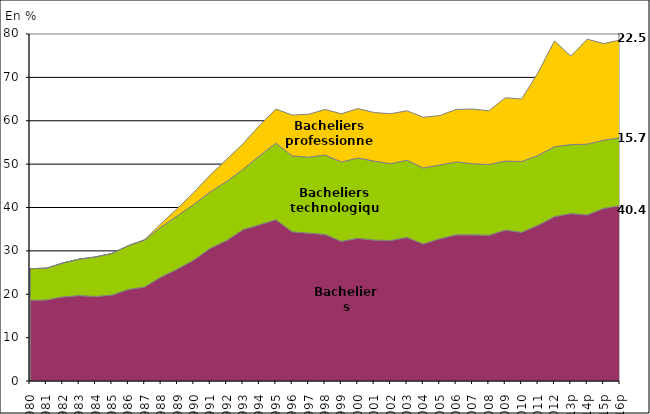
| Category | Bacheliers généraux | Bacheliers technologiques | Bacheliers professionnels |
|---|---|---|---|
| 1980 | 18.6 | 7.3 | 0 |
| 1981 | 18.7 | 7.3 | 0 |
| 1982 | 19.4 | 7.8 | 0 |
| 1983 | 19.7 | 8.4 | 0 |
| 1984 | 19.5 | 9.1 | 0 |
| 1985 | 19.8 | 9.6 | 0 |
| 1986 | 21.1 | 10.1 | 0 |
| 1987 | 21.7 | 10.8 | 0.1 |
| 1988 | 24 | 11.5 | 0.8 |
| 1989 | 25.8 | 12.3 | 1.7 |
| 1990 | 27.9 | 12.8 | 2.8 |
| 1991 | 30.6 | 13 | 3.9 |
| 1992 | 32.4 | 13.6 | 5.1 |
| 1993 | 34.9 | 13.9 | 5.9 |
| 1994 | 36 | 15.9 | 7 |
| 1995 | 37.2 | 17.6 | 7.9 |
| 1996 | 34.4 | 17.5 | 9.4 |
| 1997 | 34.1 | 17.5 | 9.9 |
| 1998 | 33.8 | 18.3 | 10.5 |
| 1999 | 32.2 | 18.3 | 11.1 |
| 2000 | 32.9 | 18.5 | 11.4 |
| 2001 | 32.5 | 18.2 | 11.2 |
| 2002 | 32.4 | 17.7 | 11.5 |
| 2003 | 33.1 | 17.8 | 11.4 |
| 2004 | 31.6 | 17.5 | 11.7 |
| 2005 | 32.8 | 17 | 11.4 |
| 2006 | 33.7 | 16.8 | 12.1 |
| 2007 | 33.7 | 16.4 | 12.6 |
| 2008 | 33.6 | 16.3 | 12.4 |
| 2009 | 34.8 | 15.9 | 14.6 |
| 2010 | 34.3 | 16.3 | 14.4 |
| 2011 | 35.9 | 16.1 | 19.1 |
| 2012 | 37.9 | 16.1 | 24.4 |
| 2013p | 38.6 | 15.9 | 20.4 |
| 2014p | 38.3 | 16.3 | 24.2 |
| 2015p | 39.8 | 15.7 | 22.3 |
| 2016p | 40.4 | 15.7 | 22.5 |